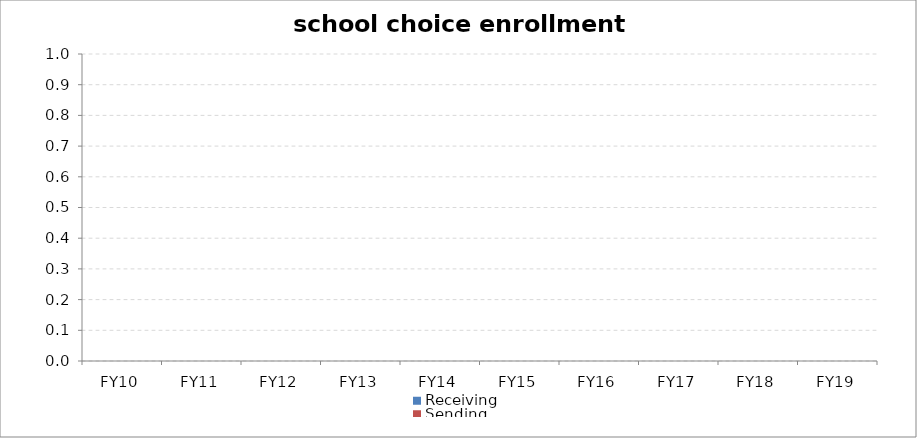
| Category | Receiving | Sending |
|---|---|---|
| FY10 | 0 | 0 |
| FY11 | 0 | 0 |
| FY12 | 0 | 0 |
| FY13 | 0 | 0 |
| FY14 | 0 | 0 |
| FY15 | 0 | 0 |
| FY16 | 0 | 0 |
| FY17 | 0 | 0 |
| FY18 | 0 | 0 |
| FY19 | 0 | 0 |